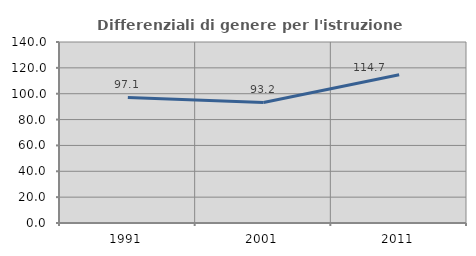
| Category | Differenziali di genere per l'istruzione superiore |
|---|---|
| 1991.0 | 97.101 |
| 2001.0 | 93.243 |
| 2011.0 | 114.706 |